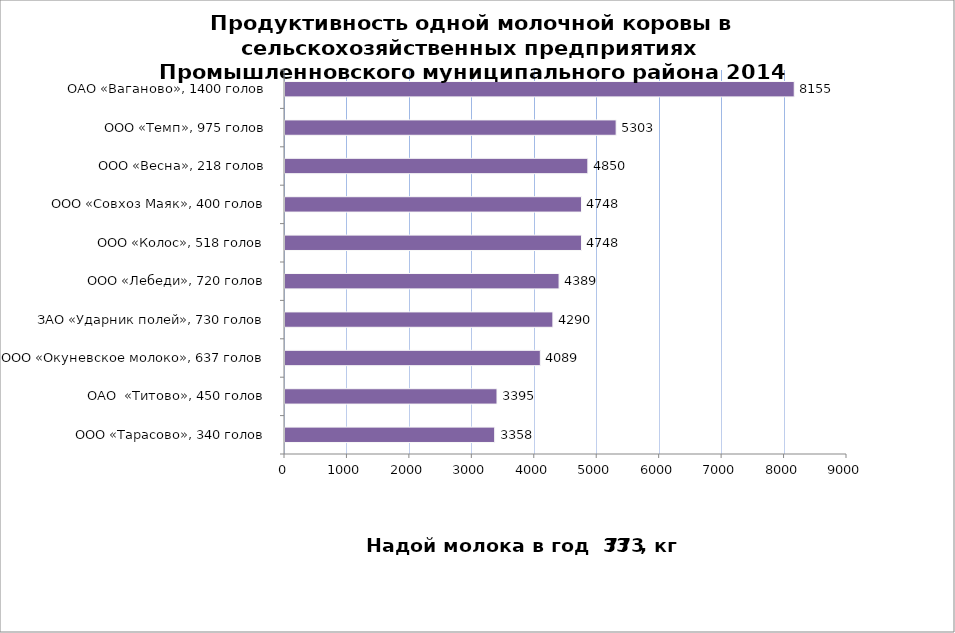
| Category | Series 0 |
|---|---|
| ООО «Тарасово», 340 голов | 3358 |
| ОАО  «Титово», 450 голов | 3395 |
| ООО «Окуневское молоко», 637 голов | 4089 |
| ЗАО «Ударник полей», 730 голов | 4290 |
| ООО «Лебеди», 720 голов | 4389 |
| ООО «Колос», 518 голов | 4748 |
| ООО «Совхоз Маяк», 400 голов | 4748 |
| ООО «Весна», 218 голов | 4850 |
| ООО «Темп», 975 голов | 5303 |
| ОАО «Ваганово», 1400 голов | 8155 |